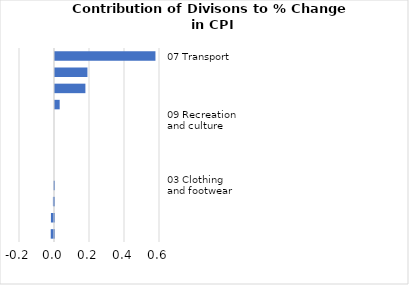
| Category |     Contributions |
|---|---|
| 07 Transport | 0.574 |
| 01 Food and non-alcoholic beverages | 0.185 |
| 04 Housing, water, electricity, gas and other fuels | 0.174 |
| 12 Miscellaneous goods and services | 0.027 |
| 09 Recreation and culture | 0 |
| 11 Restaurants and hotels | 0 |
| 10 Education | 0 |
| 08 Communication | 0 |
| 03 Clothing and footwear | -0.003 |
| 06 Health | -0.006 |
| 02 Alcoholic beverages, tobacco and narcotics | -0.018 |
| 05 Furnishings, household equipment and maintenance | -0.019 |